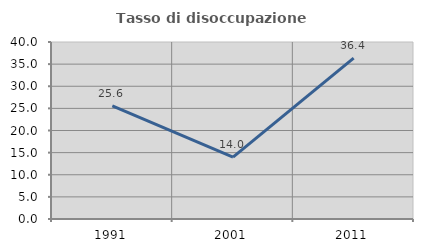
| Category | Tasso di disoccupazione giovanile  |
|---|---|
| 1991.0 | 25.581 |
| 2001.0 | 14 |
| 2011.0 | 36.364 |